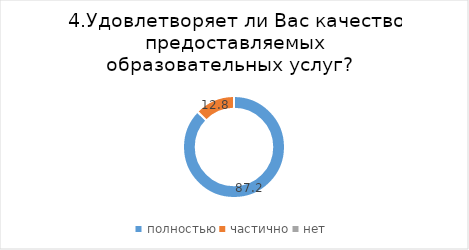
| Category | Series 0 |
|---|---|
| полностью | 87.234 |
| частично | 12.766 |
| нет | 0 |